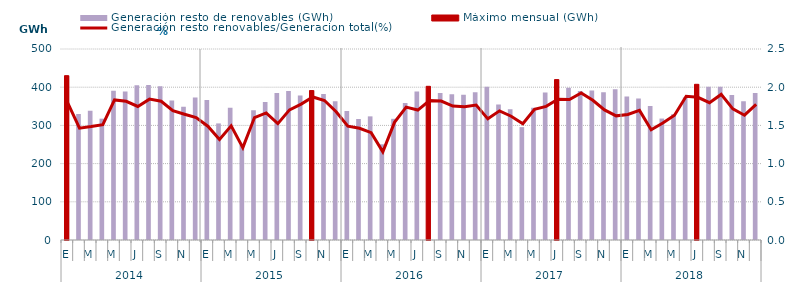
| Category | Generación resto de renovables (GWh) | Máximo mensual (GWh) |
|---|---|---|
| 0 | 430.235 | 430.235 |
| 1 | 329.865 | 0 |
| 2 | 338.314 | 0 |
| 3 | 317.638 | 0 |
| 4 | 390.743 | 0 |
| 5 | 388.436 | 0 |
| 6 | 405.228 | 0 |
| 7 | 405.869 | 0 |
| 8 | 402.163 | 0 |
| 9 | 365.304 | 0 |
| 10 | 348.547 | 0 |
| 11 | 372.774 | 0 |
| 12 | 366.342 | 0 |
| 13 | 305.191 | 0 |
| 14 | 346.51 | 0 |
| 15 | 249.274 | 0 |
| 16 | 339.962 | 0 |
| 17 | 361.504 | 0 |
| 18 | 385.125 | 0 |
| 19 | 389.73 | 0 |
| 20 | 378.339 | 0 |
| 21 | 391.17 | 391.17 |
| 22 | 382.48 | 0 |
| 23 | 363.223 | 0 |
| 24 | 337.767 | 0 |
| 25 | 316.822 | 0 |
| 26 | 323.67 | 0 |
| 27 | 250.537 | 0 |
| 28 | 317.278 | 0 |
| 29 | 358.69 | 0 |
| 30 | 388.956 | 0 |
| 31 | 402.341 | 402.341 |
| 32 | 384.904 | 0 |
| 33 | 381.279 | 0 |
| 34 | 379.932 | 0 |
| 35 | 386.775 | 0 |
| 36 | 401.263 | 0 |
| 37 | 354.803 | 0 |
| 38 | 342.55 | 0 |
| 39 | 295.467 | 0 |
| 40 | 346.165 | 0 |
| 41 | 386.302 | 0 |
| 42 | 419.869 | 419.869 |
| 43 | 398.846 | 0 |
| 44 | 389.738 | 0 |
| 45 | 391.345 | 0 |
| 46 | 386.468 | 0 |
| 47 | 394.771 | 0 |
| 48 | 375.856 | 0 |
| 49 | 370.492 | 0 |
| 50 | 350.867 | 0 |
| 51 | 317.941 | 0 |
| 52 | 329.126 | 0 |
| 53 | 372.937 | 0 |
| 54 | 407.566 | 407.566 |
| 55 | 401.36 | 0 |
| 56 | 401.001 | 0 |
| 57 | 379.545 | 0 |
| 58 | 363.125 | 0 |
| 59 | 384.703 | 0 |